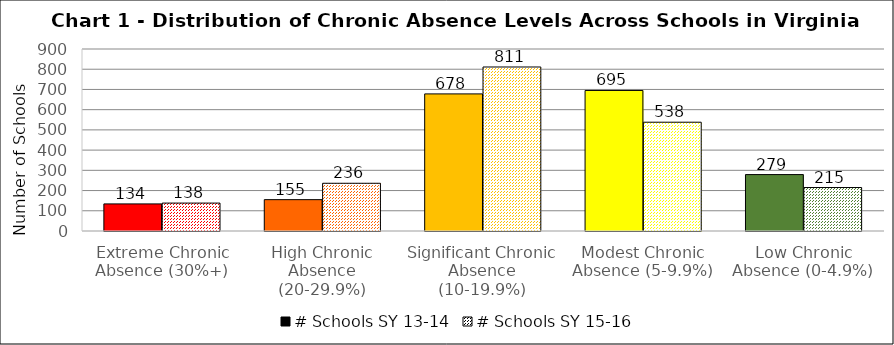
| Category | # Schools SY 13-14 | # Schools SY 15-16 |
|---|---|---|
| Extreme Chronic Absence (30%+) | 134 | 138 |
| High Chronic Absence (20-29.9%) | 155 | 236 |
| Significant Chronic Absence (10-19.9%) | 678 | 811 |
| Modest Chronic Absence (5-9.9%) | 695 | 538 |
| Low Chronic Absence (0-4.9%) | 279 | 215 |